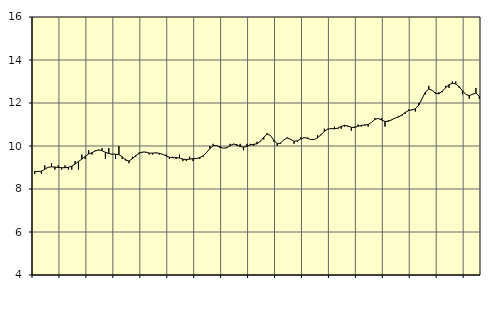
| Category | Piggar | Utbildning, SNI 85 |
|---|---|---|
| nan | 8.7 | 8.82 |
| 87.0 | 8.8 | 8.81 |
| 87.0 | 8.7 | 8.83 |
| 87.0 | 9.1 | 8.92 |
| nan | 9 | 9.01 |
| 88.0 | 9.2 | 9.03 |
| 88.0 | 8.9 | 9.02 |
| 88.0 | 9.1 | 9 |
| nan | 8.9 | 8.99 |
| 89.0 | 9.1 | 8.99 |
| 89.0 | 8.9 | 9.01 |
| 89.0 | 8.9 | 9.06 |
| nan | 9.3 | 9.16 |
| 90.0 | 8.9 | 9.28 |
| 90.0 | 9.6 | 9.39 |
| 90.0 | 9.4 | 9.52 |
| nan | 9.8 | 9.63 |
| 91.0 | 9.6 | 9.69 |
| 91.0 | 9.8 | 9.77 |
| 91.0 | 9.8 | 9.82 |
| nan | 9.9 | 9.78 |
| 92.0 | 9.4 | 9.71 |
| 92.0 | 9.9 | 9.65 |
| 92.0 | 9.6 | 9.62 |
| nan | 9.4 | 9.62 |
| 93.0 | 10 | 9.6 |
| 93.0 | 9.4 | 9.5 |
| 93.0 | 9.4 | 9.34 |
| nan | 9.2 | 9.3 |
| 94.0 | 9.5 | 9.41 |
| 94.0 | 9.5 | 9.55 |
| 94.0 | 9.7 | 9.66 |
| nan | 9.7 | 9.72 |
| 95.0 | 9.7 | 9.72 |
| 95.0 | 9.6 | 9.67 |
| 95.0 | 9.6 | 9.67 |
| nan | 9.7 | 9.68 |
| 96.0 | 9.6 | 9.66 |
| 96.0 | 9.6 | 9.61 |
| 96.0 | 9.6 | 9.54 |
| nan | 9.4 | 9.48 |
| 97.0 | 9.5 | 9.45 |
| 97.0 | 9.4 | 9.46 |
| 97.0 | 9.6 | 9.44 |
| nan | 9.3 | 9.39 |
| 98.0 | 9.3 | 9.37 |
| 98.0 | 9.5 | 9.39 |
| 98.0 | 9.3 | 9.41 |
| nan | 9.4 | 9.42 |
| 99.0 | 9.4 | 9.46 |
| 99.0 | 9.5 | 9.54 |
| 99.0 | 9.7 | 9.69 |
| nan | 10 | 9.88 |
| 0.0 | 10.1 | 10.01 |
| 0.0 | 10 | 10.02 |
| 0.0 | 10 | 9.94 |
| nan | 9.9 | 9.9 |
| 1.0 | 9.9 | 9.92 |
| 1.0 | 10.1 | 10.01 |
| 1.0 | 10.1 | 10.09 |
| nan | 10 | 10.06 |
| 2.0 | 10.1 | 9.98 |
| 2.0 | 9.8 | 9.94 |
| 2.0 | 10.1 | 9.98 |
| nan | 10.1 | 10.05 |
| 3.0 | 10 | 10.08 |
| 3.0 | 10.2 | 10.1 |
| 3.0 | 10.2 | 10.22 |
| nan | 10.3 | 10.41 |
| 4.0 | 10.6 | 10.55 |
| 4.0 | 10.5 | 10.49 |
| 4.0 | 10.2 | 10.27 |
| nan | 10 | 10.1 |
| 5.0 | 10.1 | 10.14 |
| 5.0 | 10.3 | 10.29 |
| 5.0 | 10.4 | 10.37 |
| nan | 10.3 | 10.31 |
| 6.0 | 10.1 | 10.22 |
| 6.0 | 10.2 | 10.24 |
| 6.0 | 10.4 | 10.33 |
| nan | 10.4 | 10.39 |
| 7.0 | 10.4 | 10.36 |
| 7.0 | 10.3 | 10.3 |
| 7.0 | 10.3 | 10.3 |
| nan | 10.5 | 10.38 |
| 8.0 | 10.5 | 10.53 |
| 8.0 | 10.8 | 10.68 |
| 8.0 | 10.8 | 10.78 |
| nan | 10.8 | 10.81 |
| 9.0 | 10.9 | 10.8 |
| 9.0 | 10.8 | 10.83 |
| 9.0 | 10.8 | 10.91 |
| nan | 10.9 | 10.96 |
| 10.0 | 10.9 | 10.93 |
| 10.0 | 10.7 | 10.87 |
| 10.0 | 10.9 | 10.86 |
| nan | 11 | 10.92 |
| 11.0 | 10.9 | 10.96 |
| 11.0 | 11 | 10.97 |
| 11.0 | 10.9 | 11 |
| nan | 11.1 | 11.1 |
| 12.0 | 11.3 | 11.24 |
| 12.0 | 11.3 | 11.28 |
| 12.0 | 11.3 | 11.21 |
| nan | 10.9 | 11.14 |
| 13.0 | 11.2 | 11.15 |
| 13.0 | 11.2 | 11.22 |
| 13.0 | 11.3 | 11.3 |
| nan | 11.4 | 11.35 |
| 14.0 | 11.4 | 11.44 |
| 14.0 | 11.5 | 11.56 |
| 14.0 | 11.7 | 11.65 |
| nan | 11.7 | 11.68 |
| 15.0 | 11.6 | 11.73 |
| 15.0 | 12 | 11.9 |
| 15.0 | 12.2 | 12.2 |
| nan | 12.4 | 12.51 |
| 16.0 | 12.8 | 12.65 |
| 16.0 | 12.6 | 12.59 |
| 16.0 | 12.5 | 12.45 |
| nan | 12.5 | 12.43 |
| 17.0 | 12.5 | 12.55 |
| 17.0 | 12.8 | 12.71 |
| 17.0 | 12.7 | 12.85 |
| nan | 13 | 12.92 |
| 18.0 | 13 | 12.89 |
| 18.0 | 12.7 | 12.76 |
| 18.0 | 12.4 | 12.57 |
| nan | 12.4 | 12.4 |
| 19.0 | 12.2 | 12.34 |
| 19.0 | 12.4 | 12.41 |
| 19.0 | 12.7 | 12.46 |
| nan | 12.2 | 12.31 |